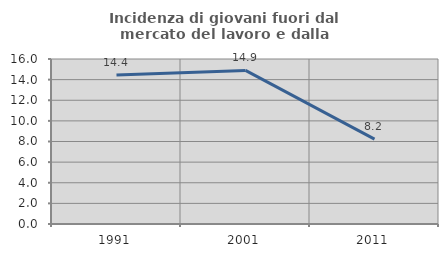
| Category | Incidenza di giovani fuori dal mercato del lavoro e dalla formazione  |
|---|---|
| 1991.0 | 14.444 |
| 2001.0 | 14.894 |
| 2011.0 | 8.235 |